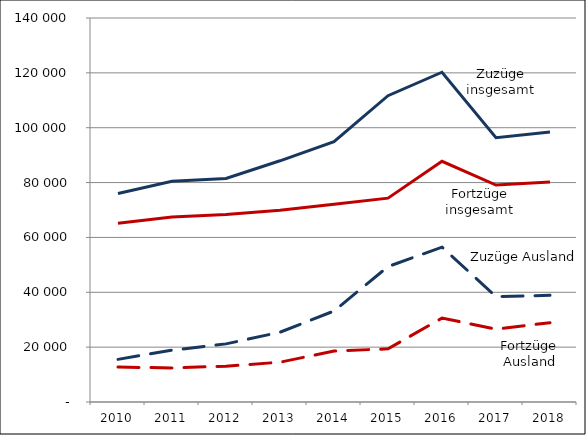
| Category | Zuzüge insgesamt | Zuzüge Ausland | Fortzüge insgesamt | Fortzüge Ausland |
|---|---|---|---|---|
| 2010.0 | 76032 | 15542 | 65209 | 12763 |
| 2011.0 | 80446 | 18887 | 67433 | 12401 |
| 2012.0 | 81472 | 21188 | 68334 | 13076 |
| 2013.0 | 87939 | 25439 | 69872 | 14506 |
| 2014.0 | 94900 | 33167 | 72104 | 18593 |
| 2015.0 | 111661 | 49379 | 74317 | 19376 |
| 2016.0 | 120235 | 56476 | 87754 | 30599 |
| 2017.0 | 96375 | 38438 | 79097 | 26566 |
| 2018.0 | 98424 | 38891 | 80217 | 28929 |